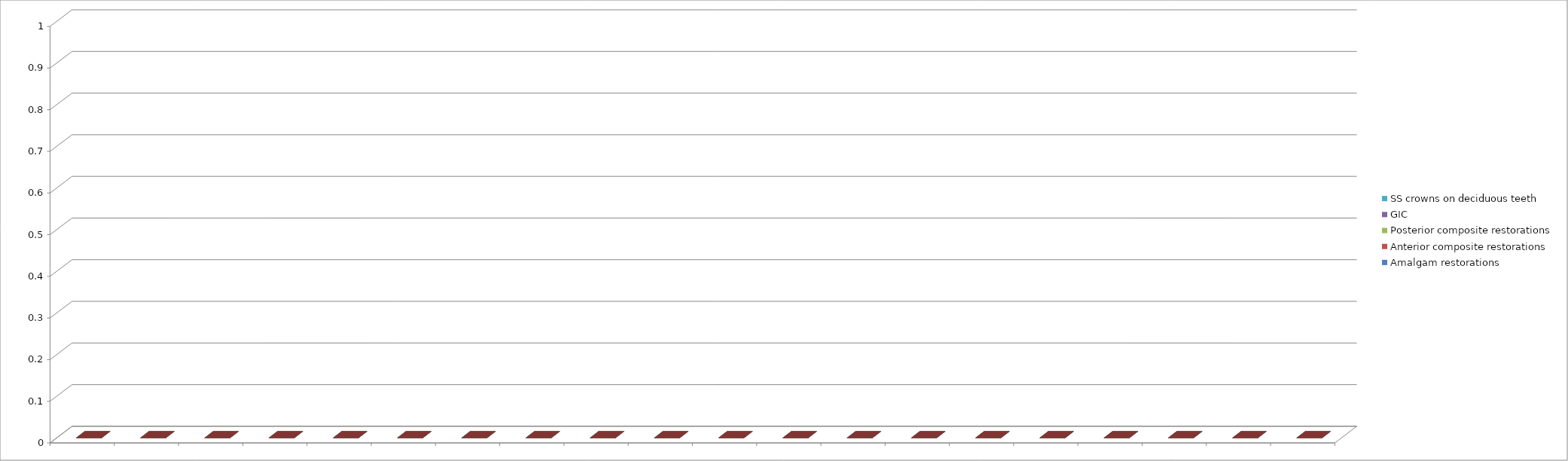
| Category | Amalgam restorations | Anterior composite restorations | Posterior composite restorations | GIC | SS crowns on deciduous teeth |
|---|---|---|---|---|---|
| 0 | 0 | 0 | 0 | 0 | 0 |
| 1 | 0 | 0 | 0 | 0 | 0 |
| 2 | 0 | 0 | 0 | 0 | 0 |
| 3 | 0 | 0 | 0 | 0 | 0 |
| 4 | 0 | 0 | 0 | 0 | 0 |
| 5 | 0 | 0 | 0 | 0 | 0 |
| 6 | 0 | 0 | 0 | 0 | 0 |
| 7 | 0 | 0 | 0 | 0 | 0 |
| 8 | 0 | 0 | 0 | 0 | 0 |
| 9 | 0 | 0 | 0 | 0 | 0 |
| 10 | 0 | 0 | 0 | 0 | 0 |
| 11 | 0 | 0 | 0 | 0 | 0 |
| 12 | 0 | 0 | 0 | 0 | 0 |
| 13 | 0 | 0 | 0 | 0 | 0 |
| 14 | 0 | 0 | 0 | 0 | 0 |
| 15 | 0 | 0 | 0 | 0 | 0 |
| 16 | 0 | 0 | 0 | 0 | 0 |
| 17 | 0 | 0 | 0 | 0 | 0 |
| 18 | 0 | 0 | 0 | 0 | 0 |
| 19 | 0 | 0 | 0 | 0 | 0 |